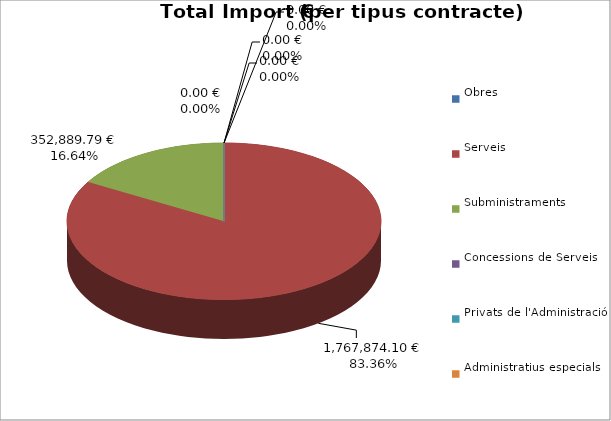
| Category | Total preu
(amb IVA) |
|---|---|
| Obres | 0 |
| Serveis | 1767874.097 |
| Subministraments | 352889.792 |
| Concessions de Serveis | 0 |
| Privats de l'Administració | 0 |
| Administratius especials | 0 |